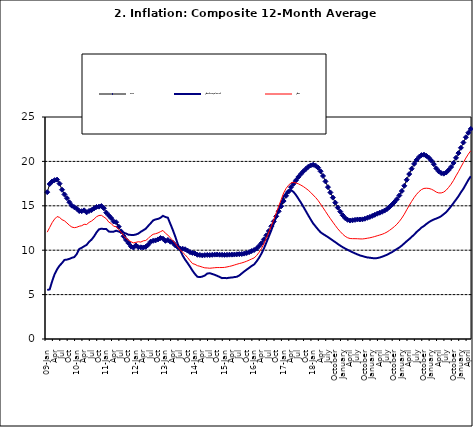
| Category | Food | All Items less Farm Produce | All Items |
|---|---|---|---|
| 09-Jan | 16.536 | 5.519 | 12.032 |
| Feb | 17.454 | 5.591 | 12.567 |
| Mar | 17.742 | 6.51 | 13.101 |
| Apr | 17.89 | 7.302 | 13.51 |
| May | 17.949 | 7.847 | 13.787 |
| June | 17.498 | 8.259 | 13.694 |
| Jul | 16.808 | 8.554 | 13.437 |
| Aug | 16.278 | 8.906 | 13.307 |
| Sep | 15.859 | 8.942 | 13.065 |
| Oct | 15.396 | 9.024 | 12.803 |
| Nov | 15.018 | 9.143 | 12.609 |
| Dec | 14.841 | 9.226 | 12.538 |
| 10-Jan | 14.668 | 9.567 | 12.586 |
| Feb | 14.411 | 10.138 | 12.7 |
| Mar | 14.395 | 10.269 | 12.757 |
| Apr | 14.489 | 10.444 | 12.915 |
| May | 14.266 | 10.597 | 12.893 |
| Jun | 14.424 | 10.948 | 13.132 |
| Jul | 14.514 | 11.193 | 13.284 |
| Aug | 14.706 | 11.549 | 13.5 |
| Sep | 14.872 | 11.997 | 13.764 |
| Oct | 14.906 | 12.345 | 13.908 |
| Nov | 14.967 | 12.423 | 13.928 |
| Dec | 14.723 | 12.383 | 13.74 |
| 11-Jan | 14.233 | 12.385 | 13.542 |
| Feb | 13.903 | 12.099 | 13.161 |
| Mar | 13.606 | 12.077 | 13.001 |
| Apr | 13.227 | 12.088 | 12.694 |
| May | 13.152 | 12.198 | 12.648 |
| Jun | 12.654 | 12.1 | 12.321 |
| Jul | 12.118 | 12.109 | 12.009 |
| Aug | 11.575 | 11.98 | 11.635 |
| Sep | 11.155 | 11.877 | 11.363 |
| Oct | 10.797 | 11.746 | 11.13 |
| Nov | 10.422 | 11.721 | 10.952 |
| Dec | 10.298 | 11.706 | 10.826 |
| 12-Jan | 10.538 | 11.765 | 10.886 |
| 12-Feb | 10.336 | 11.872 | 10.955 |
| 12-Mar | 10.325 | 12.075 | 10.914 |
| Apr | 10.304 | 12.242 | 11.054 |
| May | 10.387 | 12.419 | 11.096 |
| Jun | 10.617 | 12.732 | 11.32 |
| Jul | 10.963 | 13.032 | 11.599 |
| Aug | 11.056 | 13.349 | 11.791 |
| Sep | 11.104 | 13.467 | 11.859 |
| Oct | 11.216 | 13.525 | 11.948 |
| Nov | 11.372 | 13.649 | 12.091 |
| Dec | 11.296 | 13.873 | 12.224 |
| 13-Jan | 11.055 | 13.737 | 11.908 |
| Feb | 11.153 | 13.657 | 11.703 |
| Mar | 10.951 | 12.963 | 11.394 |
| Apr | 10.844 | 12.281 | 11.072 |
| May | 10.548 | 11.531 | 10.761 |
| Jun | 10.352 | 10.704 | 10.383 |
| Jul | 10.186 | 10.005 | 10.047 |
| Aug | 10.168 | 9.4 | 9.761 |
| Sep | 10.105 | 8.939 | 9.486 |
| Oct | 9.955 | 8.553 | 9.167 |
| Nov | 9.774 | 8.136 | 8.815 |
| Dec | 9.695 | 7.691 | 8.496 |
| 14-Jan | 9.626 | 7.317 | 8.408 |
| Feb | 9.484 | 7.005 | 8.257 |
| Mar | 9.464 | 6.976 | 8.19 |
| Apr | 9.416 | 7.03 | 8.092 |
| May | 9.448 | 7.151 | 8.012 |
| Jun | 9.464 | 7.369 | 7.998 |
| Jul | 9.459 | 7.411 | 7.968 |
| Aug | 9.481 | 7.325 | 7.996 |
| Sep | 9.501 | 7.228 | 8.027 |
| Oct | 9.508 | 7.116 | 8.047 |
| Nov | 9.492 | 6.991 | 8.046 |
| Dec | 9.481 | 6.854 | 8.047 |
| 15-Jan | 9.475 | 6.865 | 8.063 |
| Feb | 9.486 | 6.852 | 8.117 |
| Mar | 9.495 | 6.905 | 8.176 |
| Apr | 9.501 | 6.922 | 8.243 |
| May | 9.51 | 6.975 | 8.331 |
| Jun | 9.535 | 7.006 | 8.417 |
| Jul | 9.552 | 7.154 | 8.497 |
| Aug | 9.571 | 7.384 | 8.566 |
| Sep | 9.614 | 7.605 | 8.658 |
| Oct | 9.68 | 7.812 | 8.76 |
| Nov | 9.778 | 8.016 | 8.879 |
| Dec | 9.898 | 8.222 | 9.009 |
| 16-Jan | 10.017 | 8.391 | 9.13 |
| Feb | 10.184 | 8.732 | 9.386 |
| Mar | 10.471 | 9.132 | 9.751 |
| Apr | 10.786 | 9.614 | 10.182 |
| May | 11.221 | 10.196 | 10.746 |
| Jun | 11.672 | 10.864 | 11.372 |
| Jul | 12.162 | 11.553 | 12.045 |
| Aug | 12.696 | 12.247 | 12.744 |
| Sep | 13.238 | 12.98 | 13.454 |
| Oct | 13.817 | 13.757 | 14.206 |
| Nov | 14.386 | 14.542 | 14.958 |
| Dec | 14.946 | 15.307 | 15.697 |
| 17-Jan | 15.536 | 16.042 | 16.441 |
| Feb | 16.127 | 16.436 | 16.958 |
| Mar | 16.598 | 16.682 | 17.315 |
| Apr | 17.106 | 16.772 | 17.591 |
| May | 17.477 | 16.567 | 17.628 |
| Jun | 17.868 | 16.219 | 17.578 |
| Jul | 18.247 | 15.798 | 17.475 |
| Aug | 18.569 | 15.372 | 17.331 |
| Sep | 18.876 | 14.903 | 17.17 |
| Oct | 19.14 | 14.415 | 16.968 |
| Nov | 19.392 | 13.93 | 16.76 |
| Dec | 19.546 | 13.458 | 16.502 |
| 18-Jan | 19.621 | 13.01 | 16.215 |
| Feb | 19.521 | 12.668 | 15.93 |
| Mar | 19.294 | 12.33 | 15.599 |
| Apr | 18.886 | 12.021 | 15.196 |
| May | 18.359 | 11.828 | 14.793 |
| June | 17.745 | 11.651 | 14.371 |
| July | 17.102 | 11.478 | 13.95 |
| August | 16.501 | 11.285 | 13.546 |
| September | 15.923 | 11.092 | 13.157 |
| October | 15.355 | 10.903 | 12.777 |
| November | 14.802 | 10.703 | 12.406 |
| December | 14.348 | 10.514 | 12.095 |
| January | 13.934 | 10.339 | 11.801 |
| February | 13.62 | 10.185 | 11.564 |
| March | 13.42 | 10.044 | 11.401 |
| April | 13.339 | 9.909 | 11.314 |
| May | 13.371 | 9.77 | 11.299 |
| June | 13.418 | 9.64 | 11.297 |
| July | 13.46 | 9.524 | 11.291 |
| August | 13.458 | 9.411 | 11.271 |
| September | 13.474 | 9.337 | 11.268 |
| October | 13.544 | 9.253 | 11.298 |
| November | 13.646 | 9.189 | 11.348 |
| December | 13.743 | 9.155 | 11.396 |
| January | 13.859 | 9.112 | 11.462 |
| February | 13.98 | 9.086 | 11.539 |
| March | 14.109 | 9.112 | 11.624 |
| April | 14.221 | 9.174 | 11.706 |
| May | 14.325 | 9.267 | 11.791 |
| June | 14.46 | 9.375 | 11.904 |
| July | 14.634 | 9.484 | 12.049 |
| August | 14.869 | 9.638 | 12.233 |
| September | 15.135 | 9.775 | 12.44 |
| October | 15.416 | 9.965 | 12.664 |
| November | 15.746 | 10.136 | 12.923 |
| December | 16.169 | 10.308 | 13.246 |
| January | 16.662 | 10.519 | 13.616 |
| February | 17.251 | 10.767 | 14.053 |
| March | 17.929 | 11.015 | 14.554 |
| April | 18.576 | 11.247 | 15.039 |
| May | 19.176 | 11.502 | 15.499 |
| June | 19.721 | 11.75 | 15.927 |
| July | 20.165 | 12.052 | 16.298 |
| August | 20.499 | 12.291 | 16.601 |
| September | 20.711 | 12.553 | 16.83 |
| October | 20.753 | 12.725 | 16.958 |
| November | 20.619 | 12.956 | 16.979 |
| December | 20.403 | 13.161 | 16.953 |
| January | 20.089 | 13.326 | 16.869 |
| February | 19.687 | 13.461 | 16.728 |
| March | 19.214 | 13.562 | 16.544 |
| April | 18.876 | 13.681 | 16.449 |
| May | 18.679 | 13.83 | 16.449 |
| June | 18.619 | 14.057 | 16.542 |
| July | 18.745 | 14.278 | 16.755 |
| August | 19.021 | 14.603 | 17.07 |
| September | 19.365 | 14.934 | 17.432 |
| October | 19.829 | 15.315 | 17.865 |
| November | 20.407 | 15.687 | 18.372 |
| December | 20.937 | 16.075 | 18.847 |
| January | 21.53 | 16.519 | 19.362 |
| February | 22.124 | 16.92 | 19.873 |
| March | 22.715 | 17.413 | 20.375 |
| April | 23.222 | 17.906 | 20.816 |
| May | 23.654 | 18.332 | 21.2 |